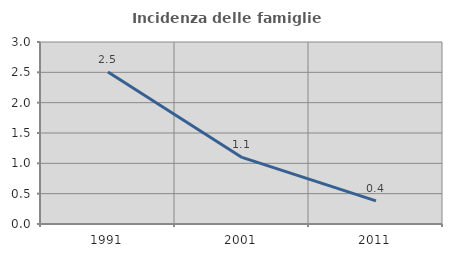
| Category | Incidenza delle famiglie numerose |
|---|---|
| 1991.0 | 2.507 |
| 2001.0 | 1.098 |
| 2011.0 | 0.381 |